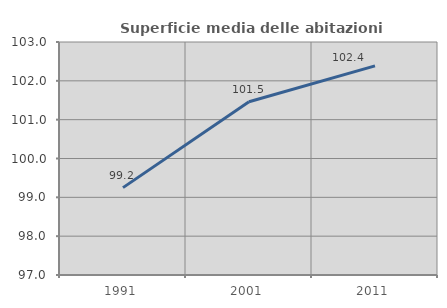
| Category | Superficie media delle abitazioni occupate |
|---|---|
| 1991.0 | 99.25 |
| 2001.0 | 101.46 |
| 2011.0 | 102.384 |